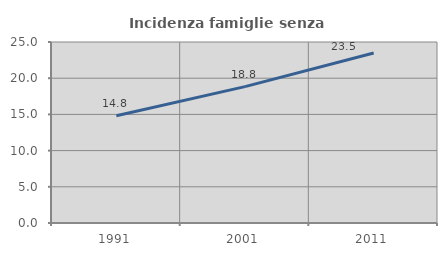
| Category | Incidenza famiglie senza nuclei |
|---|---|
| 1991.0 | 14.806 |
| 2001.0 | 18.834 |
| 2011.0 | 23.472 |